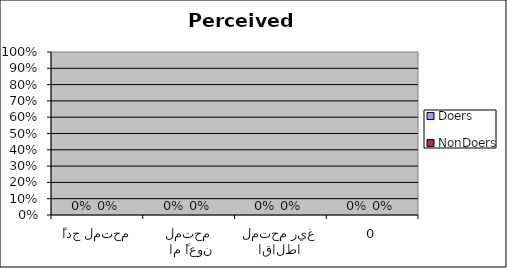
| Category | Doers | NonDoers |
|---|---|---|
|  محتمل جداً | 0 | 0 |
|  محتمل نوعاً ما | 0 | 0 |
| غير محتمل اطلاقاً | 0 | 0 |
| 0 | 0 | 0 |